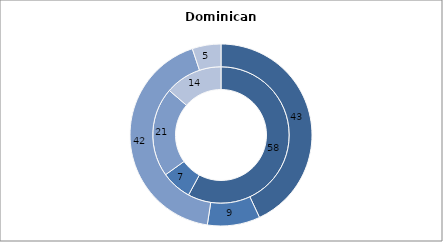
| Category | Immigrants | Native population |
|---|---|---|
| Employed | 57.9 | 43.05 |
| Unemployed | 7.21 | 9.36 |
| Non-active | 21.21 | 42.49 |
| Other | 13.68 | 5.1 |